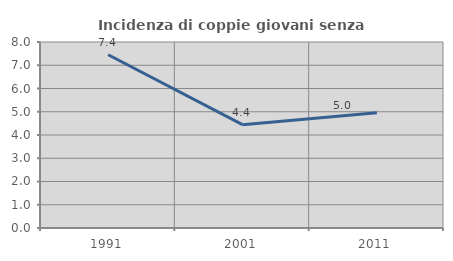
| Category | Incidenza di coppie giovani senza figli |
|---|---|
| 1991.0 | 7.45 |
| 2001.0 | 4.444 |
| 2011.0 | 4.955 |